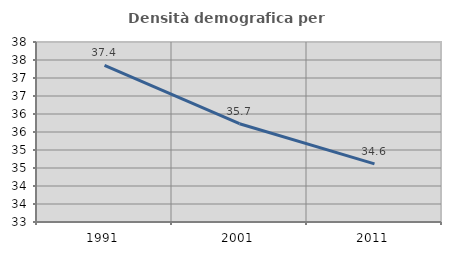
| Category | Densità demografica |
|---|---|
| 1991.0 | 37.354 |
| 2001.0 | 35.73 |
| 2011.0 | 34.613 |